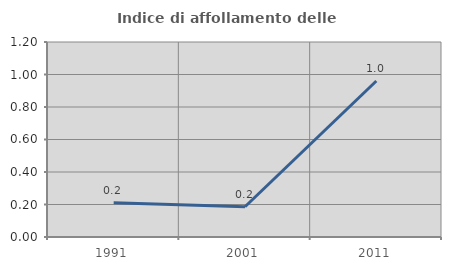
| Category | Indice di affollamento delle abitazioni  |
|---|---|
| 1991.0 | 0.211 |
| 2001.0 | 0.186 |
| 2011.0 | 0.96 |